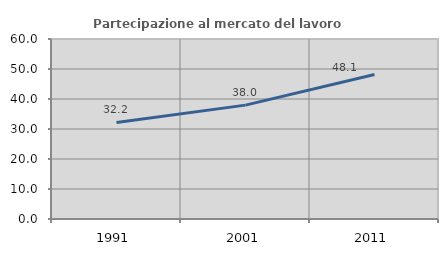
| Category | Partecipazione al mercato del lavoro  femminile |
|---|---|
| 1991.0 | 32.189 |
| 2001.0 | 37.959 |
| 2011.0 | 48.148 |